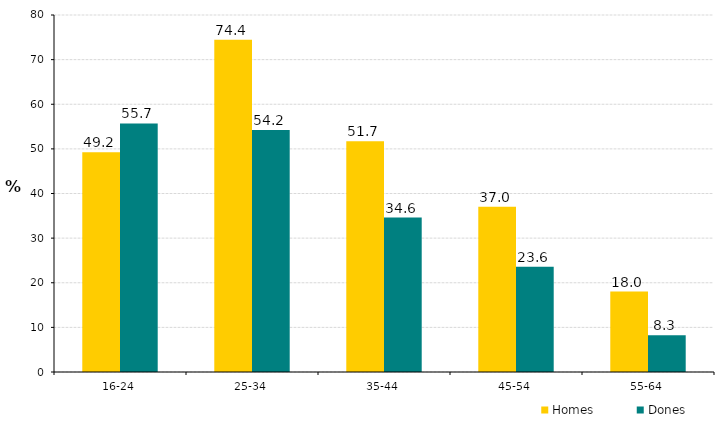
| Category | Homes | Dones |
|---|---|---|
| 16-24 | 49.219 | 55.687 |
| 25-34 | 74.428 | 54.241 |
| 35-44 | 51.7 | 34.599 |
| 45-54 | 37.026 | 23.567 |
| 55-64 | 18.026 | 8.259 |